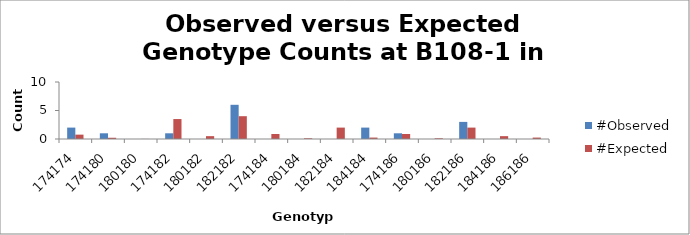
| Category | #Observed | #Expected |
|---|---|---|
| 174174.0 | 2 | 0.766 |
| 174180.0 | 1 | 0.219 |
| 180180.0 | 0 | 0.016 |
| 174182.0 | 1 | 3.5 |
| 180182.0 | 0 | 0.5 |
| 182182.0 | 6 | 4 |
| 174184.0 | 0 | 0.875 |
| 180184.0 | 0 | 0.125 |
| 182184.0 | 0 | 2 |
| 184184.0 | 2 | 0.25 |
| 174186.0 | 1 | 0.875 |
| 180186.0 | 0 | 0.125 |
| 182186.0 | 3 | 2 |
| 184186.0 | 0 | 0.5 |
| 186186.0 | 0 | 0.25 |